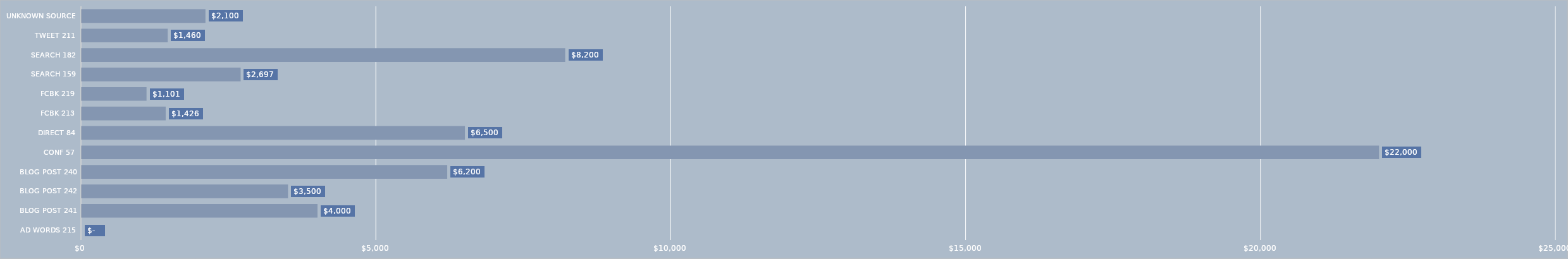
| Category | Series 0 |
|---|---|
| AD WORDS 215 | 0 |
| BLOG POST 241 | 4000 |
| BLOG POST 242 | 3500 |
| BLOG POST 240 | 6200 |
| CONF 57 | 22000 |
| DIRECT 84 | 6500 |
| FCBK 213 | 1426 |
| FCBK 219 | 1101 |
| SEARCH 159 | 2697 |
| SEARCH 182 | 8200 |
| TWEET 211 | 1460 |
| UNKNOWN SOURCE | 2100 |